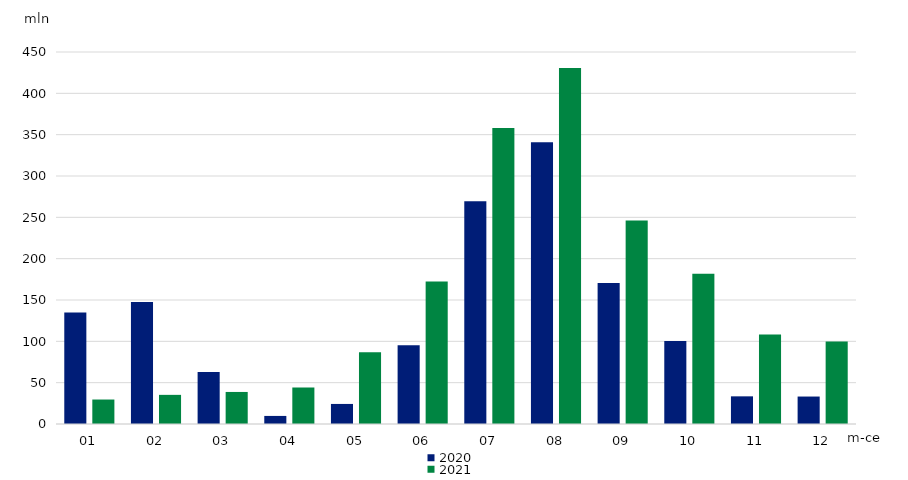
| Category | 2020 | 2021 |
|---|---|---|
| 01 | 135.027 | 29.606 |
| 02 | 147.686 | 35.25 |
| 03 | 62.806 | 38.762 |
| 04 | 9.763 | 44.153 |
| 05 | 24.263 | 86.679 |
| 06 | 95.147 | 172.518 |
| 07 | 269.511 | 357.914 |
| 08 | 340.922 | 430.785 |
| 09 | 170.441 | 246.148 |
| 10 | 100.54 | 181.875 |
| 11 | 33.46 | 108.215 |
| 12 | 33.22 | 99.673 |